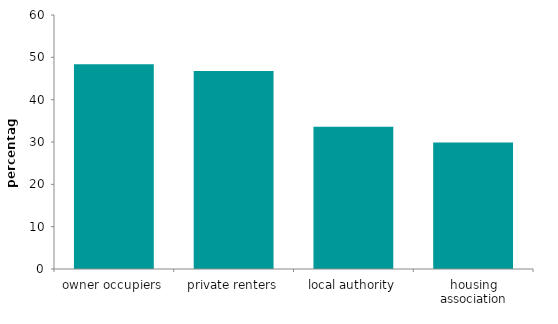
| Category | Series 0 |
|---|---|
| owner occupiers | 48.381 |
| private renters | 46.768 |
| local authority | 33.623 |
| housing association | 29.856 |